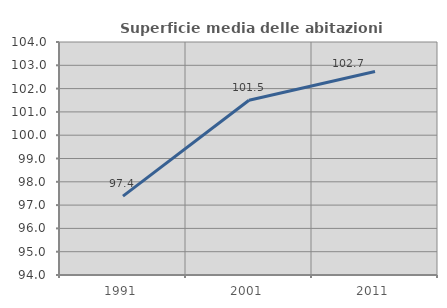
| Category | Superficie media delle abitazioni occupate |
|---|---|
| 1991.0 | 97.386 |
| 2001.0 | 101.503 |
| 2011.0 | 102.735 |